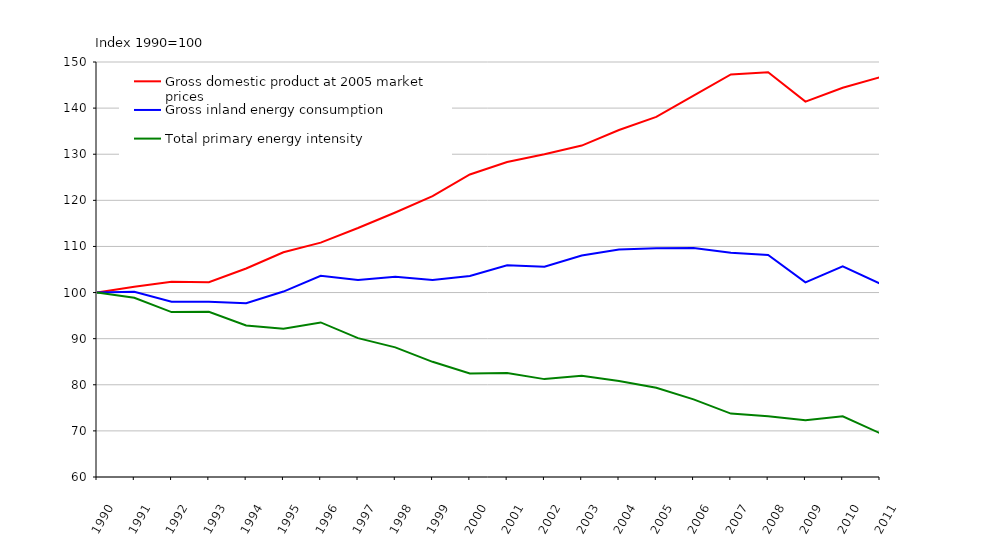
| Category | Gross domestic product at 2005 market prices | Gross inland energy consumption  | Total primary energy intensity |
|---|---|---|---|
| 1990.0 | 100 | 100 | 100 |
| 1991.0 | 101.277 | 100.148 | 98.886 |
| 1992.0 | 102.354 | 98.014 | 95.76 |
| 1993.0 | 102.238 | 97.982 | 95.837 |
| 1994.0 | 105.21 | 97.697 | 92.858 |
| 1995.0 | 108.743 | 100.214 | 92.157 |
| 1996.0 | 110.834 | 103.653 | 93.52 |
| 1997.0 | 113.994 | 102.728 | 90.117 |
| 1998.0 | 117.371 | 103.426 | 88.119 |
| 1999.0 | 120.899 | 102.739 | 84.979 |
| 2000.0 | 125.615 | 103.592 | 82.467 |
| 2001.0 | 128.314 | 105.921 | 82.548 |
| 2002.0 | 129.989 | 105.587 | 81.228 |
| 2003.0 | 131.875 | 108.05 | 81.933 |
| 2004.0 | 135.251 | 109.319 | 80.827 |
| 2005.0 | 138.085 | 109.591 | 79.365 |
| 2006.0 | 142.693 | 109.649 | 76.843 |
| 2007.0 | 147.298 | 108.636 | 73.753 |
| 2008.0 | 147.762 | 108.16 | 73.199 |
| 2009.0 | 141.409 | 102.22 | 72.287 |
| 2010.0 | 144.405 | 105.663 | 73.171 |
| 2011.0 | 146.712 | 101.956 | 69.494 |